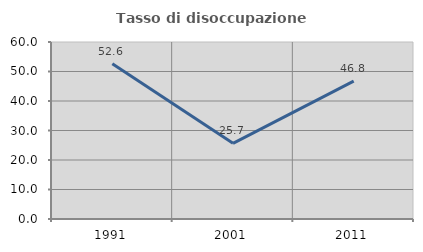
| Category | Tasso di disoccupazione giovanile  |
|---|---|
| 1991.0 | 52.613 |
| 2001.0 | 25.664 |
| 2011.0 | 46.753 |